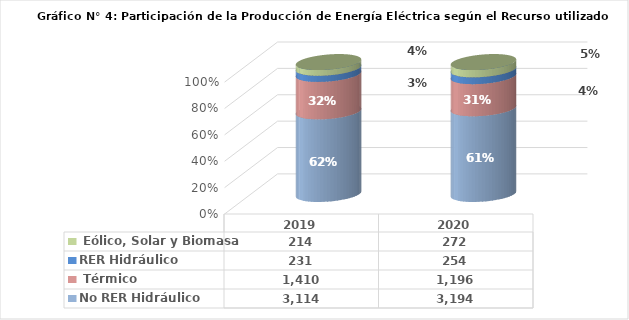
| Category | No RER | RER |
|---|---|---|
| 2019.0 | 1410.353 | 214.32 |
| 2020.0 | 1196.138 | 271.588 |